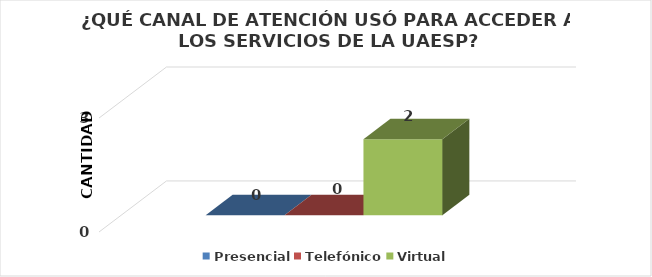
| Category | Presencial | Telefónico | Virtual |
|---|---|---|---|
| 0 | 0 | 0 | 2 |